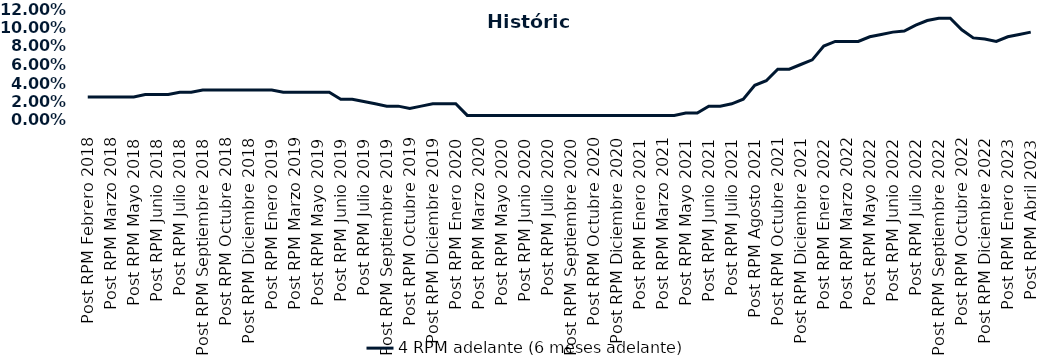
| Category | 4 RPM adelante (6 meses adelante) |
|---|---|
| Post RPM Febrero 2018 | 0.025 |
| Pre RPM Marzo 2018 | 0.025 |
| Post RPM Marzo 2018 | 0.025 |
| Pre RPM Mayo 2018 | 0.025 |
| Post RPM Mayo 2018 | 0.025 |
| Pre RPM Junio 2018 | 0.028 |
| Post RPM Junio 2018 | 0.028 |
| Pre RPM Julio 2018 | 0.028 |
| Post RPM Julio 2018 | 0.03 |
| Pre RPM Septiembre 2018 | 0.03 |
| Post RPM Septiembre 2018 | 0.032 |
| Pre RPM Octubre 2018 | 0.032 |
| Post RPM Octubre 2018 | 0.032 |
| Pre RPM Diciembre 2018 | 0.032 |
| Post RPM Diciembre 2018 | 0.032 |
| Pre RPM Enero 2019 | 0.032 |
| Post RPM Enero 2019 | 0.032 |
| Pre RPM Marzo 2019 | 0.03 |
| Post RPM Marzo 2019 | 0.03 |
| Pre RPM Mayo 2019 | 0.03 |
| Post RPM Mayo 2019 | 0.03 |
| Pre RPM Junio 2019 | 0.03 |
| Post RPM Junio 2019 | 0.022 |
| Pre RPM Julio 2019 | 0.022 |
| Post RPM Julio 2019 | 0.02 |
| Pre RPM Septiembre 2019 | 0.018 |
| Post RPM Septiembre 2019 | 0.015 |
| Pre RPM Octubre 2019 | 0.015 |
| Post RPM Octubre 2019 | 0.012 |
| Pre RPM Diciembre 2019 | 0.015 |
| Post RPM Diciembre 2019 | 0.018 |
| Pre RPM Enero 2020 | 0.018 |
| Post RPM Enero 2020 | 0.018 |
| Pre RPM Marzo 2020 | 0.005 |
| Post RPM Marzo 2020 | 0.005 |
| Pre RPM Mayo 2020 | 0.005 |
| Post RPM Mayo 2020 | 0.005 |
| Pre RPM Junio 2020 | 0.005 |
| Post RPM Junio 2020 | 0.005 |
| Pre RPM Julio 2020 | 0.005 |
| Post RPM Julio 2020 | 0.005 |
| Pre RPM Septiembre 2020 | 0.005 |
| Post RPM Septiembre 2020 | 0.005 |
| Pre RPM Octubre 2020 | 0.005 |
| Post RPM Octubre 2020 | 0.005 |
| Pre RPM Diciembre 2020 | 0.005 |
| Post RPM Diciembre 2020 | 0.005 |
| Pre RPM Enero 2021 | 0.005 |
| Post RPM Enero 2021 | 0.005 |
| Pre RPM Marzo 2021 | 0.005 |
| Post RPM Marzo 2021 | 0.005 |
| Pre RPM Mayo 2021 | 0.005 |
| Post RPM Mayo 2021 | 0.008 |
| Pre RPM Junio 2021 | 0.008 |
| Post RPM Junio 2021 | 0.015 |
| Pre RPM Julio 2021 | 0.015 |
| Post RPM Julio 2021 | 0.018 |
| Pre RPM Agosto 2021 | 0.022 |
| Post RPM Agosto 2021 | 0.038 |
| Pre RPM Octubre 2021 | 0.042 |
| Post RPM Octubre 2021 | 0.055 |
| Pre RPM Diciembre 2021 | 0.055 |
| Post RPM Diciembre 2021 | 0.06 |
| Pre RPM Enero 2022 | 0.065 |
| Post RPM Enero 2022 | 0.08 |
| Pre RPM Marzo 2022 | 0.085 |
| Post RPM Marzo 2022 | 0.085 |
| Pre RPM Mayo 2022 | 0.085 |
| Post RPM Mayo 2022 | 0.09 |
| Pre RPM Junio 2022 | 0.092 |
| Post RPM Junio 2022 | 0.095 |
| Pre RPM Julio 2022 | 0.096 |
| Post RPM Julio 2022 | 0.102 |
| Pre RPM Septiembre 2022 | 0.108 |
| Post RPM Septiembre 2022 | 0.11 |
| Pre RPM Octubre 2022 | 0.11 |
| Post RPM Octubre 2022 | 0.098 |
| Pre RPM Diciembre 2022 | 0.089 |
| Post RPM Diciembre 2022 | 0.088 |
| Pre RPM Enero 2023 | 0.085 |
| Post RPM Enero 2023 | 0.09 |
| Pre RPM Abril 2023 | 0.092 |
| Post RPM Abril 2023 | 0.095 |